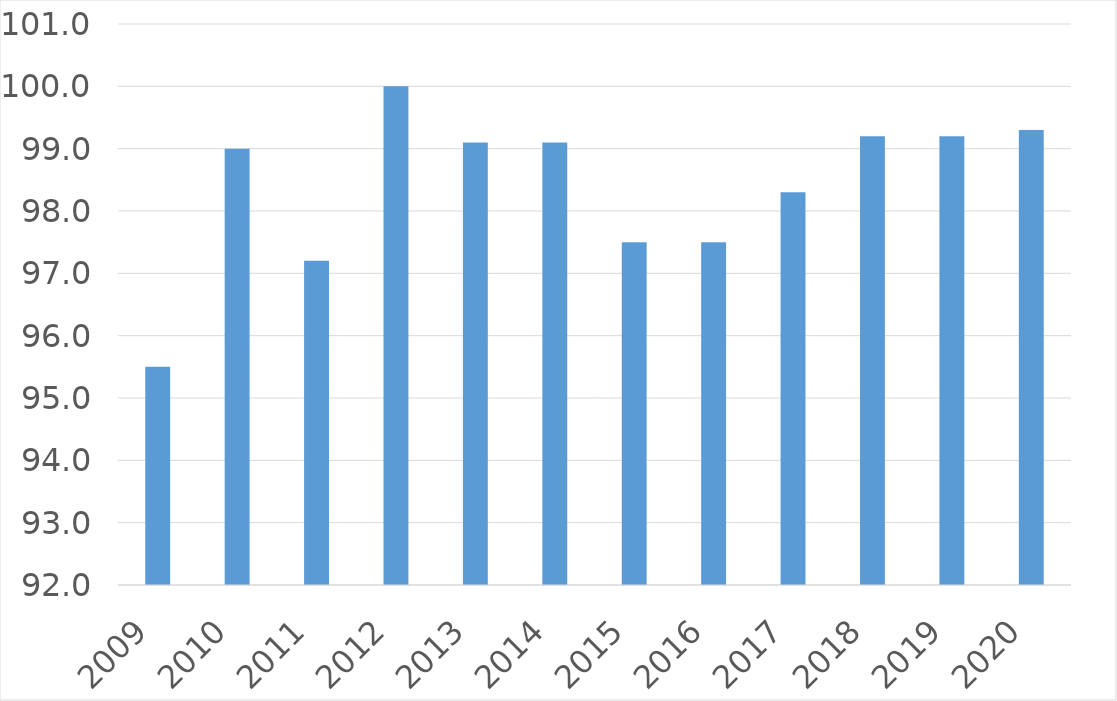
| Category | Series 0 |
|---|---|
| 2009 | 95.5 |
| 2010 | 99 |
| 2011 | 97.2 |
| 2012 | 100 |
| 2013 | 99.1 |
| 2014 | 99.1 |
| 2015 | 97.5 |
| 2016 | 97.5 |
| 2017 | 98.3 |
| 2018 | 99.2 |
| 2019 | 99.2 |
| 2020 | 99.3 |